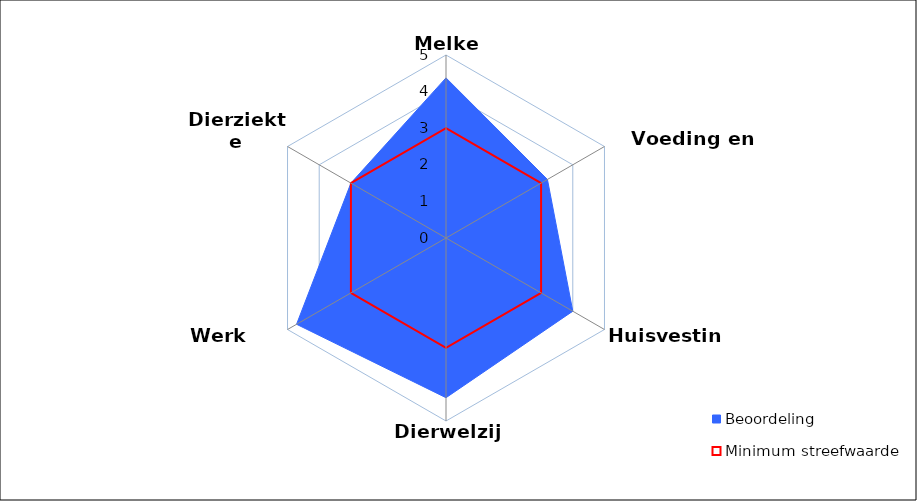
| Category | Beoordeling  | Minimum streefwaarde |
|---|---|---|
| Melken | 4.375 | 3 |
| Voeding en water | 3.2 | 3 |
| Huisvesting | 4 | 3 |
| Dierwelzijn | 4.364 | 3 |
| Werk routines | 4.714 | 3 |
| Dierziekte incidentie | 3 | 3 |